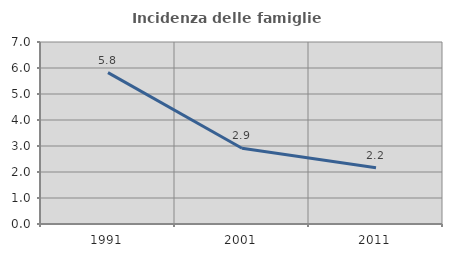
| Category | Incidenza delle famiglie numerose |
|---|---|
| 1991.0 | 5.823 |
| 2001.0 | 2.912 |
| 2011.0 | 2.162 |